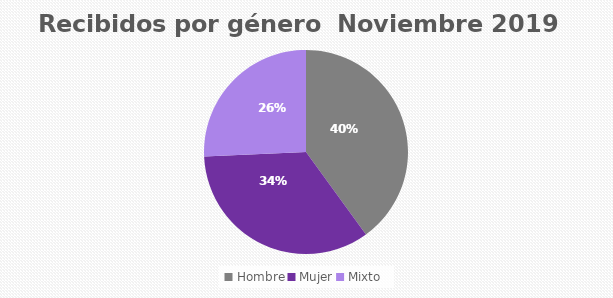
| Category | Recibidos por género  NOVIEMBRE |
|---|---|
| Hombre | 14 |
| Mujer | 12 |
| Mixto | 9 |